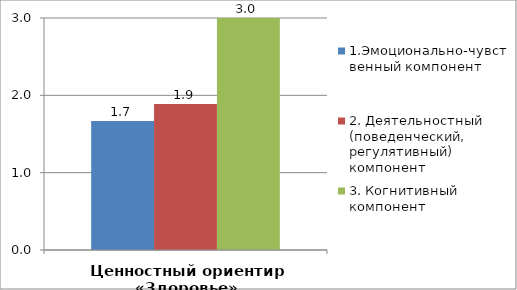
| Category | 1.Эмоционально-чувственный компонент | 2. Деятельностный (поведенческий, регулятивный) компонент | 3. Когнитивный компонент |
|---|---|---|---|
| Ценностный ориентир «Здоровье» | 1.667 | 1.889 | 3 |